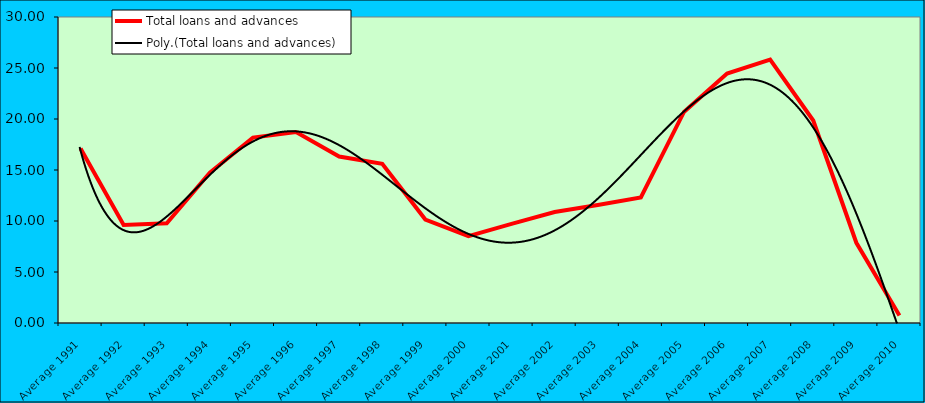
| Category | Total loans and advances |
|---|---|
| Average 1991 | 17.099 |
| Average 1992 | 9.614 |
| Average 1993 | 9.771 |
| Average 1994 | 14.737 |
| Average 1995 | 18.176 |
| Average 1996 | 18.729 |
| Average 1997 | 16.322 |
| Average 1998 | 15.608 |
| Average 1999 | 10.143 |
| Average 2000 | 8.514 |
| Average 2001 | 9.721 |
| Average 2002 | 10.884 |
| Average 2003 | 11.569 |
| Average 2004 | 12.319 |
| Average 2005 | 20.698 |
| Average 2006 | 24.459 |
| Average 2007 | 25.833 |
| Average 2008 | 19.852 |
| Average 2009 | 7.864 |
| Average 2010 | 0.742 |